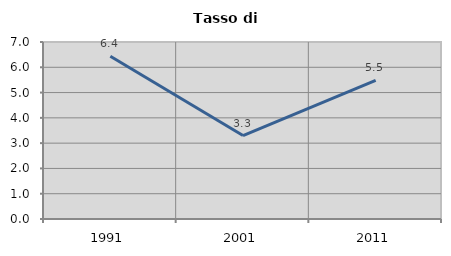
| Category | Tasso di disoccupazione   |
|---|---|
| 1991.0 | 6.439 |
| 2001.0 | 3.301 |
| 2011.0 | 5.481 |